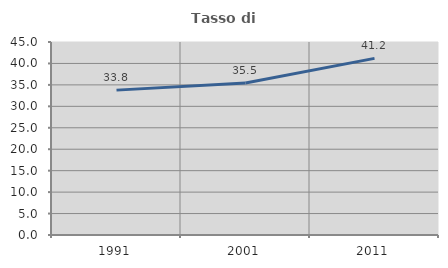
| Category | Tasso di occupazione   |
|---|---|
| 1991.0 | 33.779 |
| 2001.0 | 35.461 |
| 2011.0 | 41.176 |